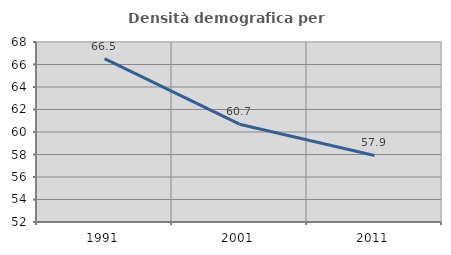
| Category | Densità demografica |
|---|---|
| 1991.0 | 66.524 |
| 2001.0 | 60.696 |
| 2011.0 | 57.917 |